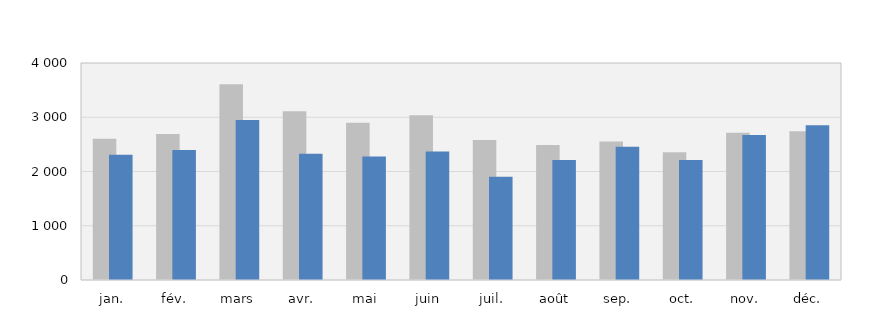
| Category | 2021 | 2022 |
|---|---|---|
| jan. | 2604 | 2308 |
| fév. | 2690 | 2398 |
| mars | 3610 | 2951 |
| avr. | 3111 | 2328 |
| mai | 2900 | 2276 |
| juin | 3039 | 2370 |
| juil. | 2579 | 1905 |
| août | 2487 | 2212 |
| sep. | 2551 | 2455 |
| oct. | 2355 | 2210 |
| nov. | 2714 | 2675 |
| déc. | 2740 | 2854 |